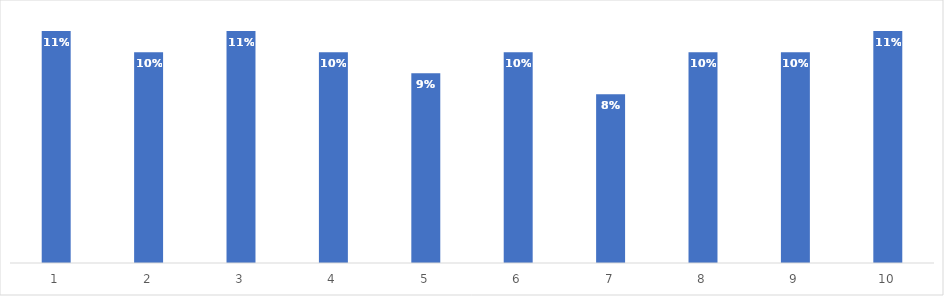
| Category | Proportions des subventions (en %) |
|---|---|
| 1.0 | 0.11 |
| 2.0 | 0.1 |
| 3.0 | 0.11 |
| 4.0 | 0.1 |
| 5.0 | 0.09 |
| 6.0 | 0.1 |
| 7.0 | 0.08 |
| 8.0 | 0.1 |
| 9.0 | 0.1 |
| 10.0 | 0.11 |